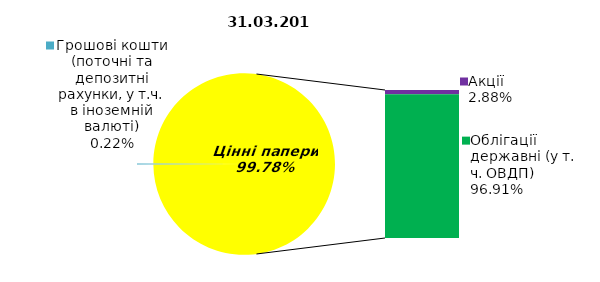
| Category | Series 0 |
|---|---|
| Грошові кошти (поточні та депозитні рахунки, у т.ч. в іноземній валюті) | 0.193 |
| Банківські метали | 0 |
| Нерухомість | 0 |
| Інші активи | 0 |
| Акції | 2.583 |
| Облігації підприємств | 0 |
| Муніципальні облігації | 0 |
| Облігації державні (у т. ч. ОВДП) | 87.052 |
| Іпотечні сертифікати | 0 |